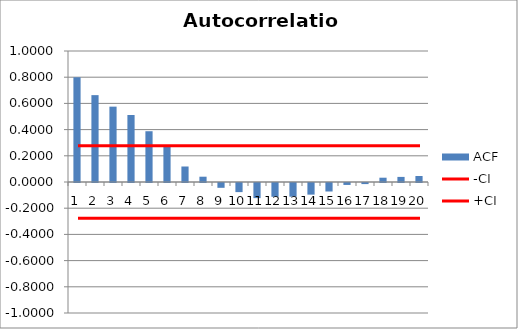
| Category | ACF |
|---|---|
| 0 | 0.8 |
| 1 | 0.663 |
| 2 | 0.575 |
| 3 | 0.511 |
| 4 | 0.388 |
| 5 | 0.276 |
| 6 | 0.118 |
| 7 | 0.04 |
| 8 | -0.037 |
| 9 | -0.07 |
| 10 | -0.115 |
| 11 | -0.105 |
| 12 | -0.105 |
| 13 | -0.089 |
| 14 | -0.065 |
| 15 | -0.015 |
| 16 | -0.008 |
| 17 | 0.033 |
| 18 | 0.039 |
| 19 | 0.046 |